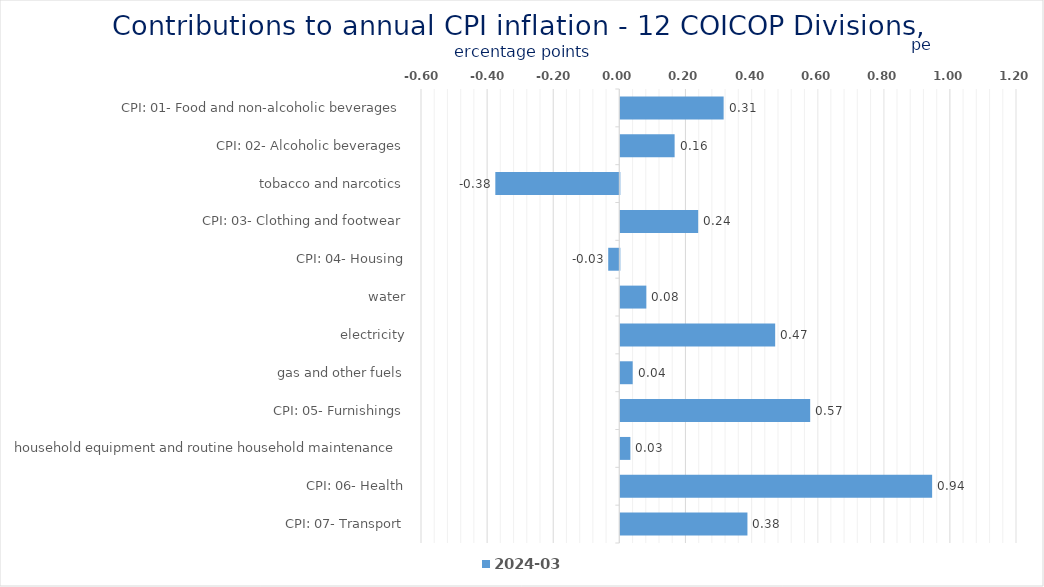
| Category | 2024-03 |
|---|---|
| CPI: 01- Food and non-alcoholic beverages | 0.313 |
| CPI: 02- Alcoholic beverages, tobacco and narcotics | 0.164 |
| CPI: 03- Clothing and footwear | -0.375 |
| CPI: 04- Housing, water, electricity, gas and other fuels | 0.236 |
| CPI: 05- Furnishings, household equipment and routine household maintenance | -0.034 |
| CPI: 06- Health | 0.079 |
| CPI: 07- Transport | 0.468 |
| CPI: 08- Communication | 0.037 |
| CPI: 09- Recreation and culture | 0.574 |
| CPI: 10- Education | 0.03 |
| CPI: 11- Restaurants and hotels | 0.943 |
| CPI: 12- Miscellaneous goods and services | 0.385 |